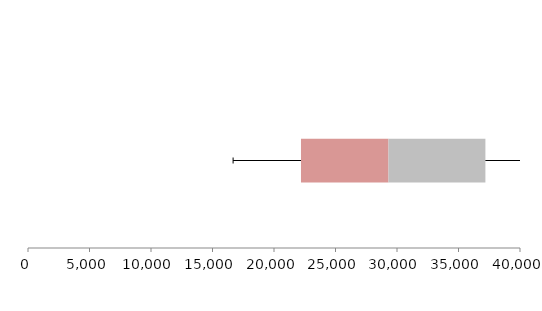
| Category | Series 1 | Series 2 | Series 3 |
|---|---|---|---|
| 0 | 22194.165 | 7113.58 | 7878.899 |